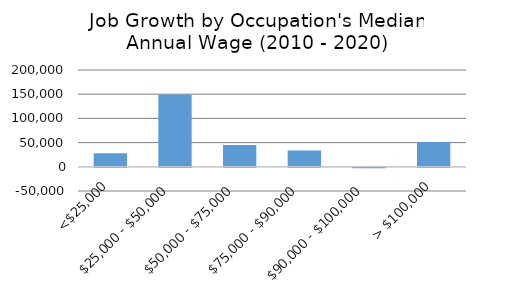
| Category | Series 0 |
|---|---|
| <$25,000 | 27892.283 |
| $25,000 - $50,000 | 149141.437 |
| $50,000 - $75,000 | 45262.869 |
| $75,000 - $90,000 | 33579.888 |
| $90,000 - $100,000 | -812.046 |
| > $100,000 | 51462.078 |